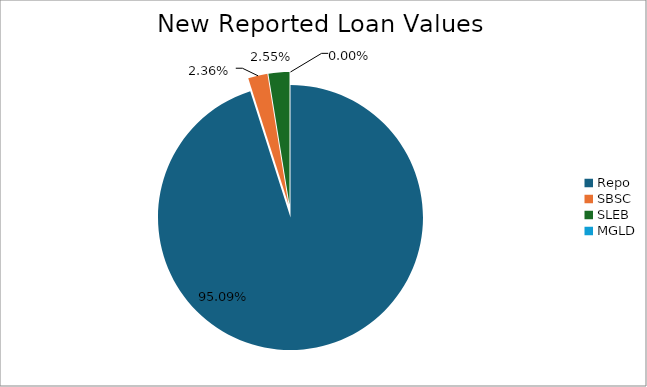
| Category | Series 0 |
|---|---|
| Repo | 12455105.661 |
| SBSC | 309760.455 |
| SLEB | 333852.572 |
| MGLD | 40.165 |